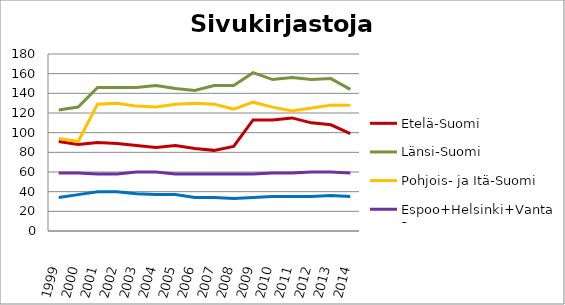
| Category | Etelä-Suomi | Länsi-Suomi | Pohjois- ja Itä-Suomi | Espoo+Helsinki+Vantaa | Muu Uusimaa |
|---|---|---|---|---|---|
| 1999.0 | 91 | 123 | 94 | 59 | 34 |
| 2000.0 | 88 | 126 | 91 | 59 | 37 |
| 2001.0 | 90 | 146 | 129 | 58 | 40 |
| 2002.0 | 89 | 146 | 130 | 58 | 40 |
| 2003.0 | 87 | 146 | 127 | 60 | 38 |
| 2004.0 | 85 | 148 | 126 | 60 | 37 |
| 2005.0 | 87 | 145 | 129 | 58 | 37 |
| 2006.0 | 84 | 143 | 130 | 58 | 34 |
| 2007.0 | 82 | 148 | 129 | 58 | 34 |
| 2008.0 | 86 | 148 | 124 | 58 | 33 |
| 2009.0 | 113 | 161 | 131 | 58 | 34 |
| 2010.0 | 113 | 154 | 126 | 59 | 35 |
| 2011.0 | 115 | 156 | 122 | 59 | 35 |
| 2012.0 | 110 | 154 | 125 | 60 | 35 |
| 2013.0 | 108 | 155 | 128 | 60 | 36 |
| 2014.0 | 99 | 144 | 128 | 59 | 35 |